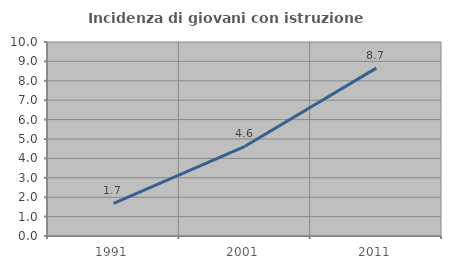
| Category | Incidenza di giovani con istruzione universitaria |
|---|---|
| 1991.0 | 1.685 |
| 2001.0 | 4.622 |
| 2011.0 | 8.654 |